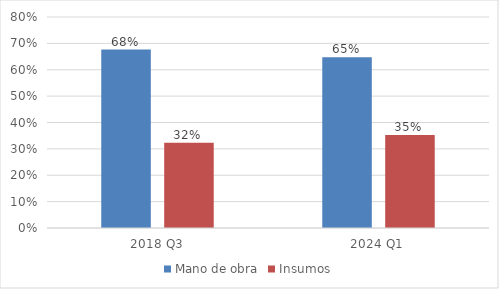
| Category | Mano de obra | Insumos |
|---|---|---|
| 2018 Q3 | 0.676 | 0.324 |
| 2024 Q1 | 0.648 | 0.352 |